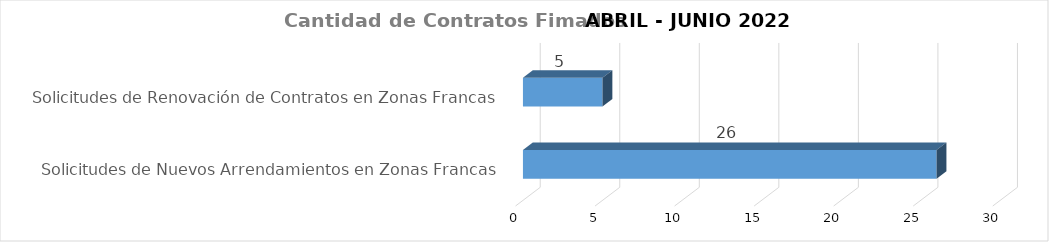
| Category | Series 0 |
|---|---|
| Solicitudes de Nuevos Arrendamientos en Zonas Francas | 26 |
| Solicitudes de Renovación de Contratos en Zonas Francas | 5 |